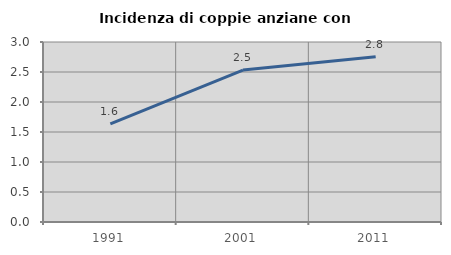
| Category | Incidenza di coppie anziane con figli |
|---|---|
| 1991.0 | 1.635 |
| 2001.0 | 2.533 |
| 2011.0 | 2.756 |